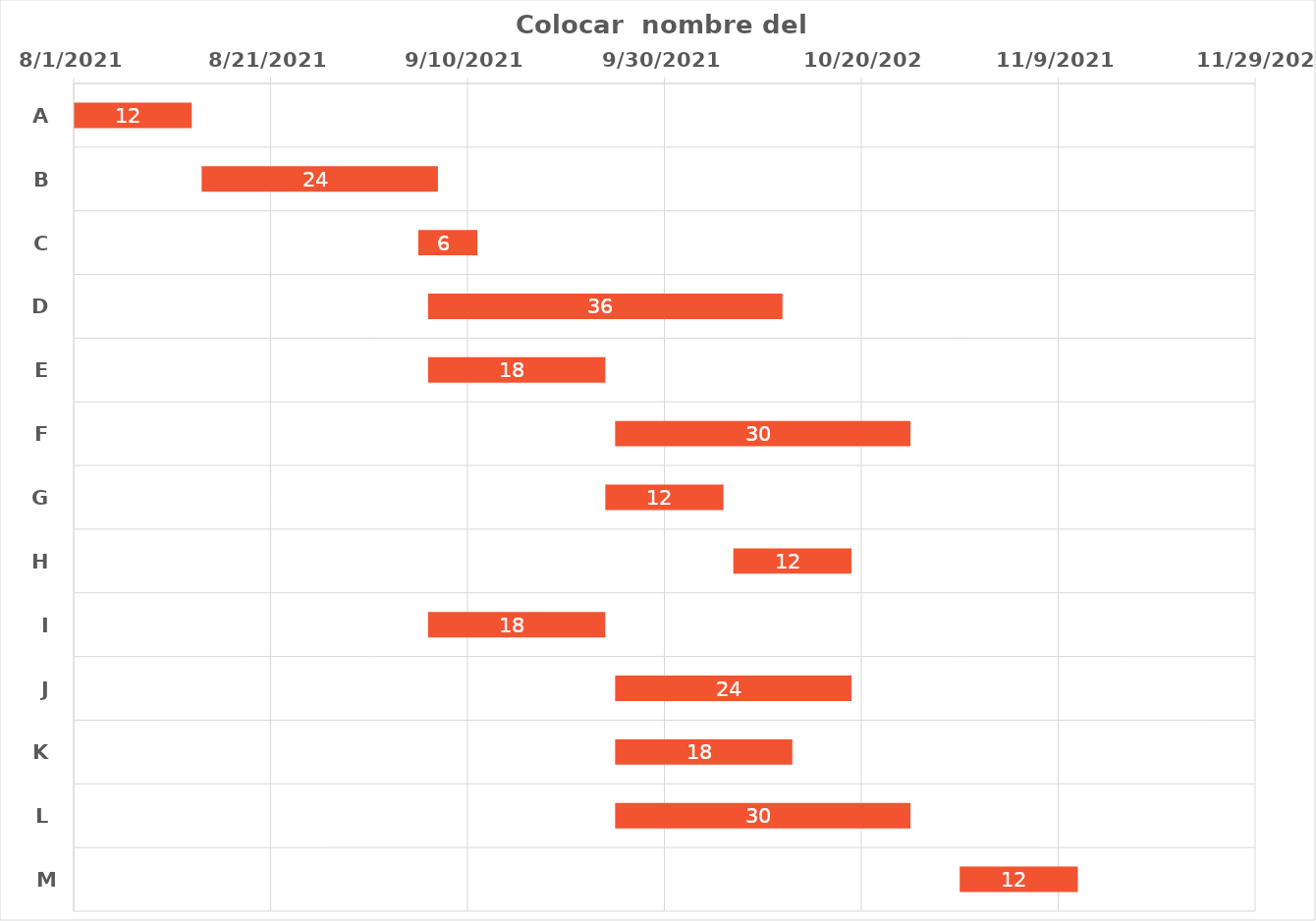
| Category | Fecha de Inicio | Tiempo (días) |
|---|---|---|
| A | 8/1/21 | 12 |
| B | 8/14/21 | 24 |
| C | 9/5/21 | 6 |
| D | 9/6/21 | 36 |
| E | 9/6/21 | 18 |
| F | 9/25/21 | 30 |
| G | 9/24/21 | 12 |
| H | 10/7/21 | 12 |
| I | 9/6/21 | 18 |
| J | 9/25/21 | 24 |
| K | 9/25/21 | 18 |
| L | 9/25/21 | 30 |
| M | 10/30/21 | 12 |